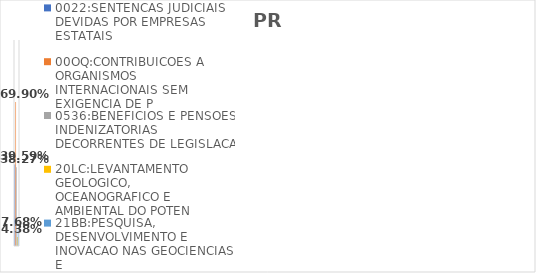
| Category | 0022:SENTENCAS JUDICIAIS DEVIDAS POR EMPRESAS ESTATAIS | 00OQ:CONTRIBUICOES A ORGANISMOS INTERNACIONAIS SEM EXIGENCIA DE P | 0536:BENEFICIOS E PENSOES INDENIZATORIAS DECORRENTES DE LEGISLACA | 20LC:LEVANTAMENTO GEOLOGICO, OCEANOGRAFICO E AMBIENTAL DO POTEN | 21BB:PESQUISA, DESENVOLVIMENTO E INOVACAO NAS GEOCIENCIAS E |
|---|---|---|---|---|---|
| EXECUTADO | 0.396 | 0.699 | 0.383 | 0.044 | 0.077 |